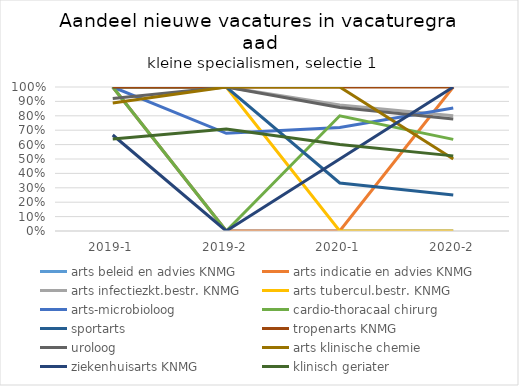
| Category | arts beleid en advies KNMG | arts indicatie en advies KNMG | arts infectiezkt.bestr. KNMG | arts tubercul.bestr. KNMG | arts-microbioloog | cardio-thoracaal chirurg | sportarts | tropenarts KNMG | uroloog | arts klinische chemie | ziekenhuisarts KNMG | klinisch geriater |
|---|---|---|---|---|---|---|---|---|---|---|---|---|
| 2019-1 | 1 | 1 | 1 | 1 | 1 | 1 | 1 | 1 | 0.92 | 0.889 | 0.667 | 0.638 |
| 2019-2 | 0 | 0 | 1 | 1 | 0.679 | 0 | 1 | 1 | 1 | 1 | 0 | 0.708 |
| 2020-1 | 0 | 0 | 0.875 | 0 | 0.719 | 0.8 | 0.333 | 1 | 0.857 | 1 | 0.5 | 0.6 |
| 2020-2 | 0 | 1 | 0.8 | 0 | 0.855 | 0.636 | 0.25 | 1 | 0.778 | 0.5 | 1 | 0.522 |